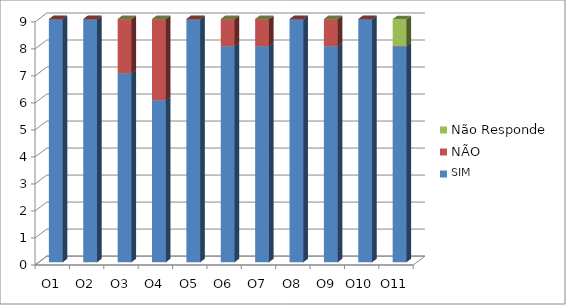
| Category | SIM | NÃO  | Não Responde |
|---|---|---|---|
| O1 | 9 | 0 | 0 |
| O2 | 9 | 0 | 0 |
| O3 | 7 | 2 | 0 |
| O4 | 6 | 3 | 0 |
| O5 | 9 | 0 | 0 |
| O6 | 8 | 1 | 0 |
| O7 | 8 | 1 | 0 |
| O8 | 9 | 0 | 0 |
| O9 | 8 | 1 | 0 |
| O10 | 9 | 0 | 0 |
| O11 | 8 | 0 | 1 |